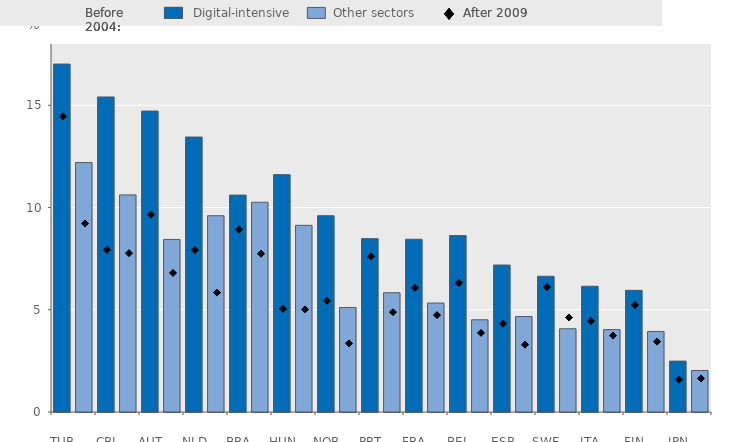
| Category | Before 2004 |
|---|---|
|       TUR | 17.02 |
|  | 12.2 |
|       CRI | 15.41 |
|  | 10.62 |
|       AUT | 14.72 |
|  | 8.44 |
|       NLD | 13.45 |
|  | 9.6 |
|       BRA | 10.61 |
|  | 10.26 |
|       HUN | 11.61 |
|  | 9.13 |
|       NOR | 9.6 |
|  | 5.11 |
|       PRT | 8.48 |
|  | 5.83 |
|       FRA | 8.45 |
|  | 5.33 |
|       BEL | 8.63 |
|  | 4.51 |
|       ESP | 7.19 |
|  | 4.67 |
|       SWE | 6.64 |
|  | 4.07 |
|       ITA | 6.15 |
|  | 4.03 |
|       FIN | 5.95 |
|  | 3.94 |
|       JPN | 2.49 |